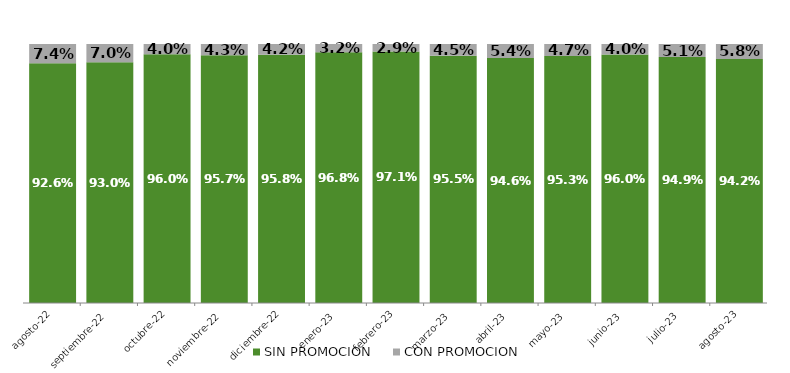
| Category | SIN PROMOCION   | CON PROMOCION   |
|---|---|---|
| 2022-08-01 | 0.926 | 0.074 |
| 2022-09-01 | 0.93 | 0.07 |
| 2022-10-01 | 0.96 | 0.04 |
| 2022-11-01 | 0.957 | 0.043 |
| 2022-12-01 | 0.958 | 0.042 |
| 2023-01-01 | 0.968 | 0.032 |
| 2023-02-01 | 0.971 | 0.029 |
| 2023-03-01 | 0.955 | 0.045 |
| 2023-04-01 | 0.946 | 0.054 |
| 2023-05-01 | 0.953 | 0.047 |
| 2023-06-01 | 0.96 | 0.04 |
| 2023-07-01 | 0.949 | 0.051 |
| 2023-08-01 | 0.942 | 0.058 |